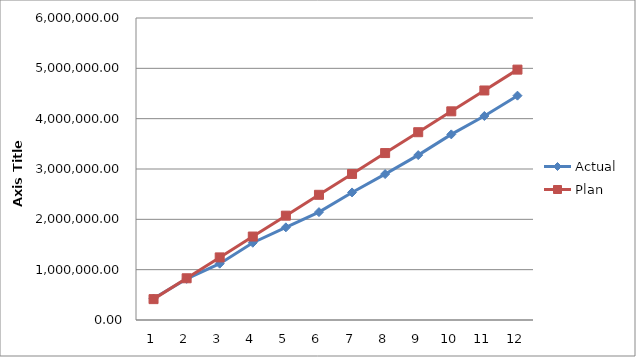
| Category | Actual | Plan |
|---|---|---|
| 0 | 426184.42 | 414550.917 |
| 1 | 817115.04 | 829101.833 |
| 2 | 1118836.29 | 1243652.75 |
| 3 | 1534958.42 | 1658203.667 |
| 4 | 1840590.52 | 2072754.583 |
| 5 | 2143501.9 | 2487305.5 |
| 6 | 2534154.27 | 2901856.417 |
| 7 | 2899041.02 | 3316407.333 |
| 8 | 3276282.84 | 3730958.25 |
| 9 | 3687897.89 | 4145509.167 |
| 10 | 4052993.2 | 4560060.083 |
| 11 | 4457018.52 | 4974611 |